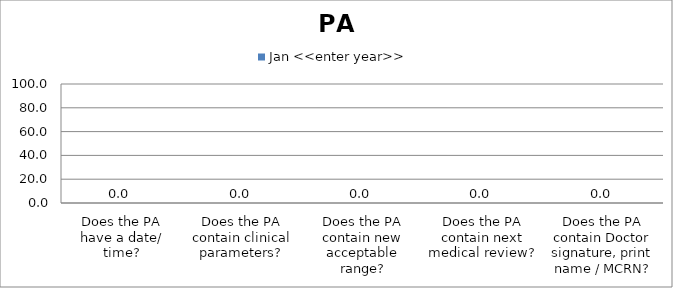
| Category | Jan <<enter year>> |
|---|---|
| Does the PA have a date/ time? | 0 |
| Does the PA contain clinical parameters? | 0 |
| Does the PA contain new acceptable range? | 0 |
| Does the PA contain next medical review? | 0 |
| Does the PA contain Doctor signature, print name / MCRN? | 0 |